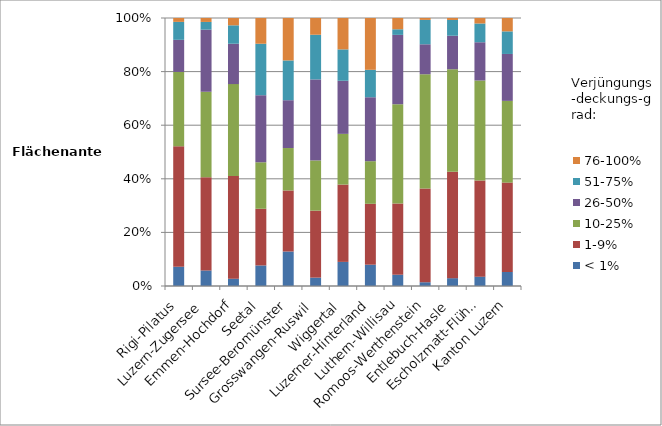
| Category | < 1% | 1-9% | 10-25% | 26-50% | 51-75% | 76-100% |
|---|---|---|---|---|---|---|
| Rigi-Pilatus | 378 | 2367 | 1461 | 630 | 353 | 76 |
| Luzern-Zugersee | 99 | 593 | 543 | 395 | 49 | 25 |
| Emmen-Hochdorf | 50 | 703 | 628 | 276 | 126 | 50 |
| Seetal | 99 | 273 | 224 | 323 | 248 | 124 |
| Sursee-Beromünster | 326 | 577 | 401 | 452 | 376 | 401 |
| Grosswangen-Ruswil | 74 | 592 | 444 | 716 | 395 | 148 |
| Wiggertal | 252 | 808 | 530 | 555 | 328 | 328 |
| Luzerner-Hinterland | 174 | 497 | 348 | 522 | 224 | 423 |
| Luthern-Willisau | 151 | 954 | 1330 | 929 | 75 | 151 |
| Romoos-Werthenstein | 50 | 1244 | 1518 | 398 | 324 | 25 |
| Entlebuch-Hasle | 100 | 1356 | 1306 | 427 | 201 | 25 |
| Escholzmatt-Flühli | 299 | 3068 | 3193 | 1222 | 599 | 175 |
| Kanton Luzern | 2053 | 13033 | 11926 | 6845 | 3297 | 1950 |